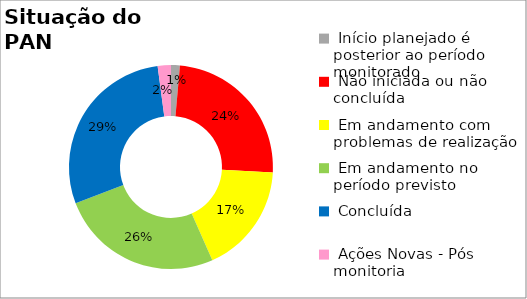
| Category | Series 0 |
|---|---|
|  Início planejado é posterior ao período monitorado | 0.014 |
|  Não iniciada ou não concluída | 0.245 |
|  Em andamento com problemas de realização | 0.175 |
|  Em andamento no período previsto  | 0.259 |
|  Concluída | 0.287 |
|  Ações Novas - Pós monitoria | 0.021 |